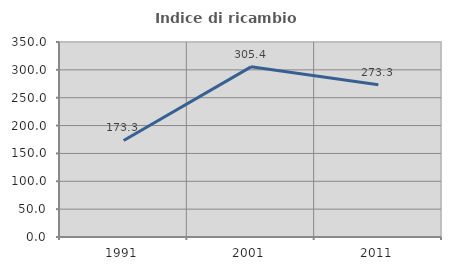
| Category | Indice di ricambio occupazionale  |
|---|---|
| 1991.0 | 173.333 |
| 2001.0 | 305.405 |
| 2011.0 | 273.333 |